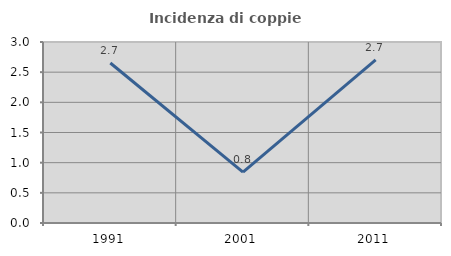
| Category | Incidenza di coppie miste |
|---|---|
| 1991.0 | 2.652 |
| 2001.0 | 0.844 |
| 2011.0 | 2.703 |